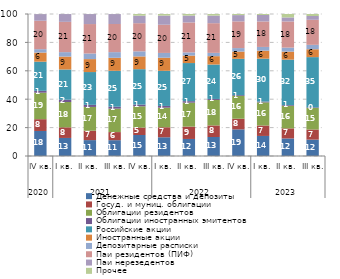
| Category | Денежные средства и депозиты | Госуд. и муниц. облигации | Облигации резидентов | Облигации иностранных эмитентов | Российские акции | Иностранные акции | Депозитарные расписки | Паи резидентов (ПИФ) | Паи нерезедентов | Прочее |
|---|---|---|---|---|---|---|---|---|---|---|
| 0 | 17.631 | 8.299 | 18.66 | 1.301 | 20.535 | 6.425 | 2.378 | 20.024 | 4.701 | 0.047 |
| 1 | 12.707 | 7.502 | 17.814 | 1.612 | 21.292 | 9.105 | 3.115 | 21.319 | 5.509 | 0.025 |
| 2 | 11.193 | 6.636 | 16.72 | 1.494 | 23.076 | 9.122 | 3.937 | 20.738 | 7.056 | 0.028 |
| 3 | 11.139 | 5.706 | 16.507 | 1.365 | 25.295 | 9.145 | 3.993 | 19.82 | 7.001 | 0.03 |
| 4 | 14.777 | 5.255 | 14.962 | 1.205 | 24.943 | 8.998 | 3.566 | 19.821 | 5.319 | 1.154 |
| 5 | 13.193 | 7.059 | 13.789 | 1.212 | 24.748 | 9.215 | 3.366 | 19.856 | 6.453 | 1.108 |
| 6 | 12 | 8.724 | 16.842 | 1.06 | 26.832 | 5.263 | 2.249 | 21.095 | 4.837 | 1.098 |
| 7 | 13.39 | 8.146 | 17.937 | 0.699 | 24.229 | 5.911 | 2.324 | 20.899 | 5.345 | 1.12 |
| 8 | 18.743 | 7.513 | 15.98 | 0.601 | 25.601 | 5.115 | 2.449 | 18.799 | 4.42 | 0.78 |
| 9 | 14.126 | 7.368 | 16.269 | 0.571 | 30.199 | 5.643 | 2.637 | 17.948 | 4.546 | 0.694 |
| 10 | 12.358 | 7.095 | 15.867 | 0.529 | 32.021 | 5.668 | 2.79 | 18.426 | 2.836 | 2.409 |
| 11 | 11.537 | 7.137 | 15.113 | 0.453 | 35.395 | 5.55 | 3.102 | 17.639 | 2.648 | 1.427 |